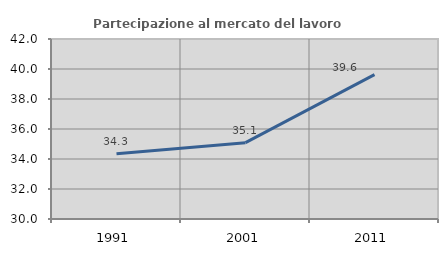
| Category | Partecipazione al mercato del lavoro  femminile |
|---|---|
| 1991.0 | 34.344 |
| 2001.0 | 35.087 |
| 2011.0 | 39.62 |